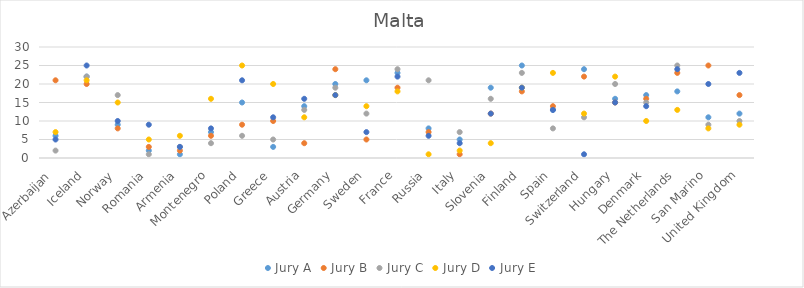
| Category | Jury A | Jury B | Jury C | Jury D | Jury E |
|---|---|---|---|---|---|
| Azerbaijan | 6 | 21 | 2 | 7 | 5 |
| Iceland | 22 | 20 | 22 | 21 | 25 |
| Norway | 9 | 8 | 17 | 15 | 10 |
| Romania | 2 | 3 | 1 | 5 | 9 |
| Armenia | 1 | 2 | 3 | 6 | 3 |
| Montenegro | 7 | 6 | 4 | 16 | 8 |
| Poland | 15 | 9 | 6 | 25 | 21 |
| Greece | 3 | 10 | 5 | 20 | 11 |
| Austria | 14 | 4 | 13 | 11 | 16 |
| Germany | 20 | 24 | 19 | 17 | 17 |
| Sweden | 21 | 5 | 12 | 14 | 7 |
| France | 23 | 19 | 24 | 18 | 22 |
| Russia | 8 | 7 | 21 | 1 | 6 |
| Italy | 5 | 1 | 7 | 2 | 4 |
| Slovenia | 19 | 12 | 16 | 4 | 12 |
| Finland | 25 | 18 | 23 | 19 | 19 |
| Spain | 13 | 14 | 8 | 23 | 13 |
| Switzerland | 24 | 22 | 11 | 12 | 1 |
| Hungary | 16 | 15 | 20 | 22 | 15 |
| Denmark | 17 | 16 | 15 | 10 | 14 |
| The Netherlands | 18 | 23 | 25 | 13 | 24 |
| San Marino | 11 | 25 | 9 | 8 | 20 |
| United Kingdom | 12 | 17 | 10 | 9 | 23 |